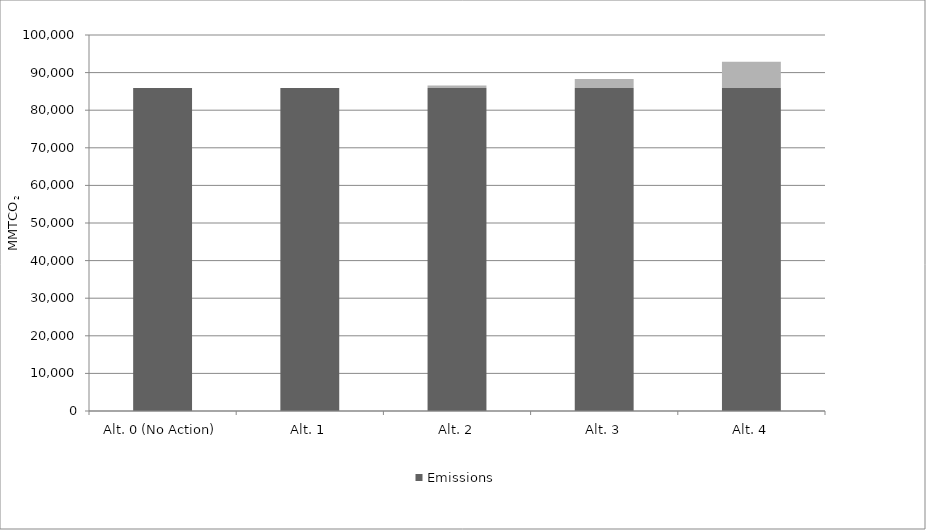
| Category | Emissions | Emissions Difference Compared to No Action Alternative |
|---|---|---|
| Alt. 0 (No Action) | 85900 | 0 |
| Alt. 1 | 85900 | 0 |
| Alt. 2 | 85900 | 700 |
| Alt. 3 | 85900 | 2400 |
| Alt. 4 | 85900 | 7000 |